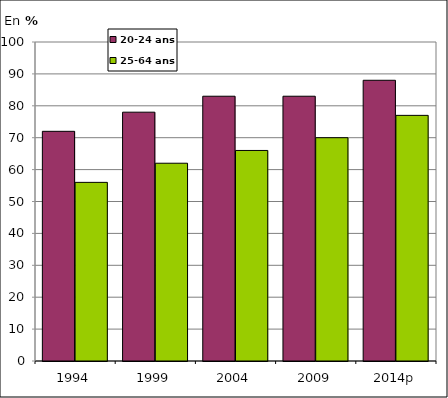
| Category | 20-24 ans | 25-64 ans |
|---|---|---|
| 1994 | 72 | 56 |
| 1999 | 78 | 62 |
| 2004 | 83 | 66 |
| 2009 | 83 | 70 |
| 2014p | 88 | 77 |